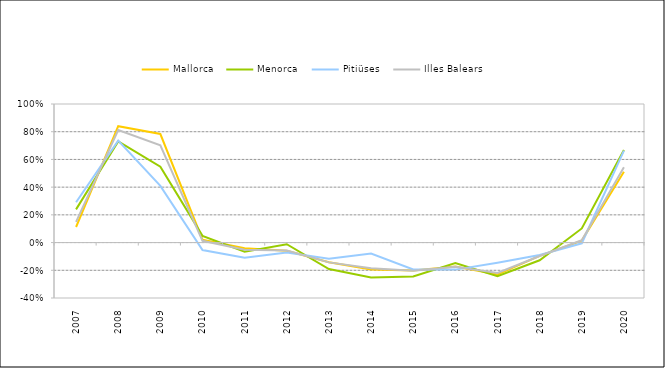
| Category | Mallorca | Menorca | Pitiüses | Illes Balears |
|---|---|---|---|---|
| 2007.0 | 0.112 | 0.239 | 0.291 | 0.15 |
| 2008.0 | 0.84 | 0.73 | 0.736 | 0.813 |
| 2009.0 | 0.783 | 0.547 | 0.409 | 0.703 |
| 2010.0 | 0.021 | 0.048 | -0.054 | 0.013 |
| 2011.0 | -0.042 | -0.066 | -0.109 | -0.052 |
| 2012.0 | -0.059 | -0.012 | -0.072 | -0.057 |
| 2013.0 | -0.142 | -0.191 | -0.117 | -0.143 |
| 2014.0 | -0.195 | -0.252 | -0.079 | -0.185 |
| 2015.0 | -0.201 | -0.245 | -0.194 | -0.203 |
| 2016.0 | -0.173 | -0.147 | -0.195 | -0.174 |
| 2017.0 | -0.229 | -0.242 | -0.145 | -0.219 |
| 2018.0 | -0.096 | -0.128 | -0.089 | -0.097 |
| 2019.0 | 0.014 | 0.102 | -0.005 | 0.017 |
| 2020.0 | 0.511 | 0.668 | 0.664 | 0.544 |